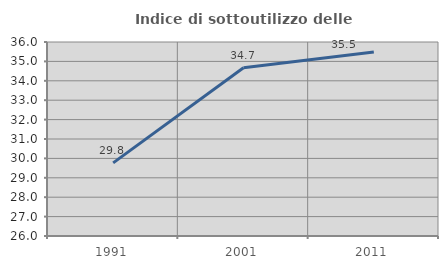
| Category | Indice di sottoutilizzo delle abitazioni  |
|---|---|
| 1991.0 | 29.77 |
| 2001.0 | 34.674 |
| 2011.0 | 35.487 |